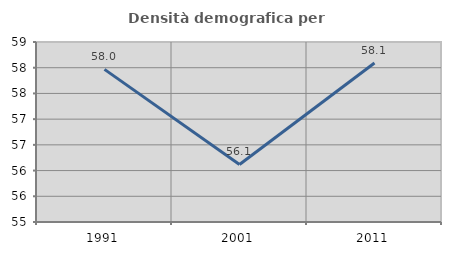
| Category | Densità demografica |
|---|---|
| 1991.0 | 57.968 |
| 2001.0 | 56.118 |
| 2011.0 | 58.091 |